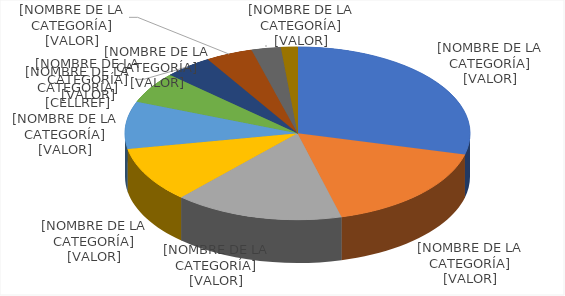
| Category | % sobre el total de derechos de voto |
|---|---|
| Amber Capital UK LLP (Josep Oughourlian) | 26.3 |
| Rucandio, S.A. (Familia Polanco) | 15.4 |
| HSBC | 14.4 |
| Telefónica, S.A. | 9.4 |
| Roberto Alcántara | 8.04 |
| Adar Capital | 5.3 |
| Banco Santander | 4.1 |
| Carlos Fernández | 4 |
| Nicolás Berggruen | 2.5 |
| CaixaBank | 1.4 |